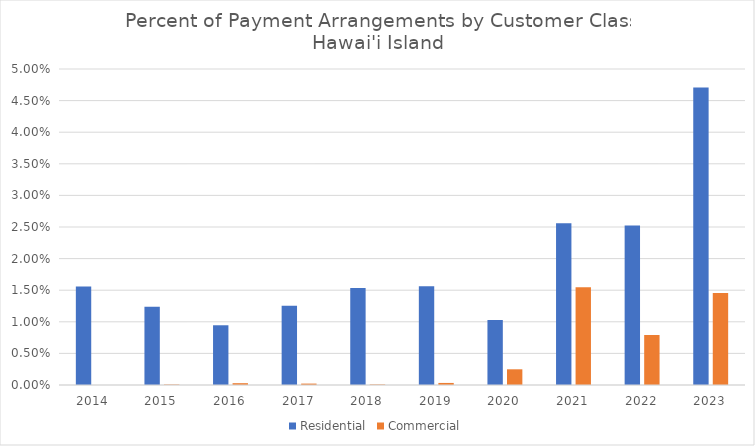
| Category | Residential | Commercial |
|---|---|---|
| 2014.0 | 0.016 | 0 |
| 2015.0 | 0.012 | 0 |
| 2016.0 | 0.009 | 0 |
| 2017.0 | 0.013 | 0 |
| 2018.0 | 0.015 | 0 |
| 2019.0 | 0.016 | 0 |
| 2020.0 | 0.01 | 0.002 |
| 2021.0 | 0.026 | 0.015 |
| 2022.0 | 0.025 | 0.008 |
| 2023.0 | 0.047 | 0.015 |